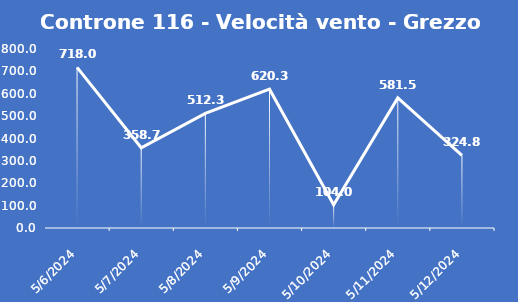
| Category | Controne 116 - Velocità vento - Grezzo (min) |
|---|---|
| 5/6/24 | 718 |
| 5/7/24 | 358.7 |
| 5/8/24 | 512.3 |
| 5/9/24 | 620.3 |
| 5/10/24 | 104 |
| 5/11/24 | 581.5 |
| 5/12/24 | 324.8 |